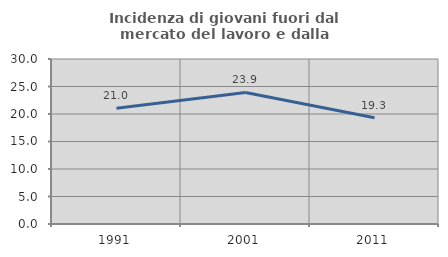
| Category | Incidenza di giovani fuori dal mercato del lavoro e dalla formazione  |
|---|---|
| 1991.0 | 21.05 |
| 2001.0 | 23.925 |
| 2011.0 | 19.315 |